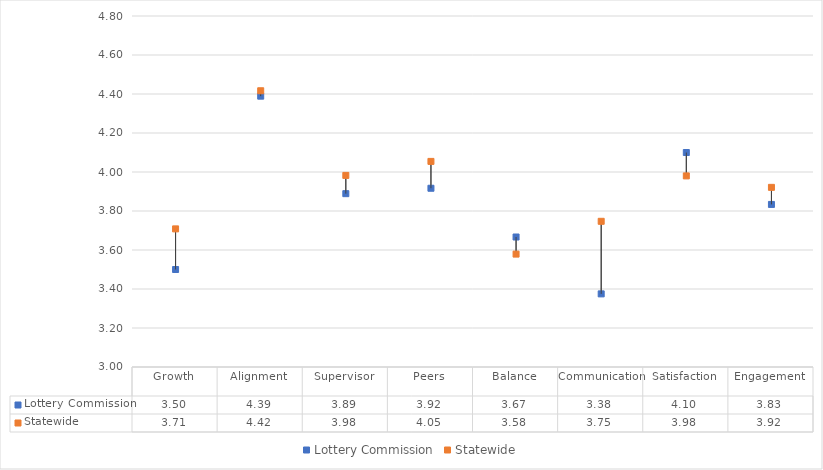
| Category | Lottery Commission | Statewide |
|---|---|---|
| Growth | 3.5 | 3.708 |
| Alignment | 4.389 | 4.417 |
| Supervisor | 3.889 | 3.983 |
| Peers | 3.917 | 4.054 |
| Balance | 3.667 | 3.579 |
| Communication | 3.375 | 3.747 |
| Satisfaction | 4.1 | 3.98 |
| Engagement | 3.834 | 3.921 |